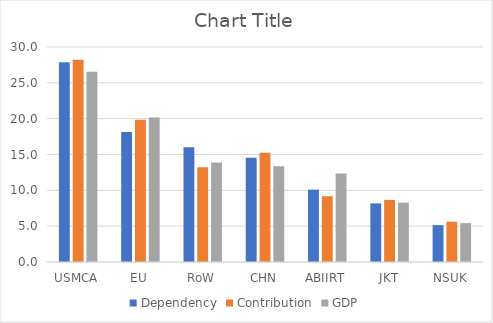
| Category | Dependency | Contribution | GDP |
|---|---|---|---|
| USMCA | 27.867 | 28.204 | 26.534 |
| EU | 18.156 | 19.846 | 20.155 |
| RoW | 16.026 | 13.216 | 13.883 |
| CHN | 14.54 | 15.26 | 13.358 |
| ABIIRT | 10.092 | 9.178 | 12.363 |
| JKT | 8.176 | 8.666 | 8.281 |
| NSUK | 5.143 | 5.629 | 5.425 |